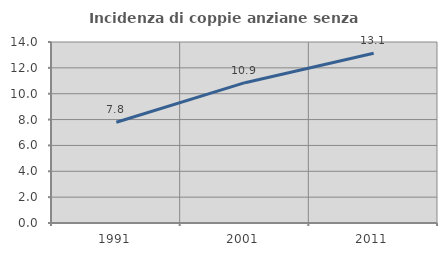
| Category | Incidenza di coppie anziane senza figli  |
|---|---|
| 1991.0 | 7.797 |
| 2001.0 | 10.854 |
| 2011.0 | 13.133 |